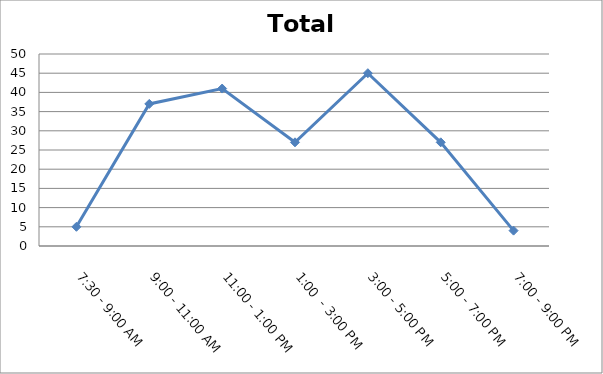
| Category | Total |
|---|---|
| 7:30 - 9:00 AM | 5 |
| 9:00 - 11:00 AM | 37 |
| 11:00 - 1:00 PM | 41 |
| 1:00  - 3:00 PM | 27 |
| 3:00 - 5:00 PM | 45 |
| 5:00 - 7:00 PM | 27 |
| 7:00 - 9:00 PM | 4 |